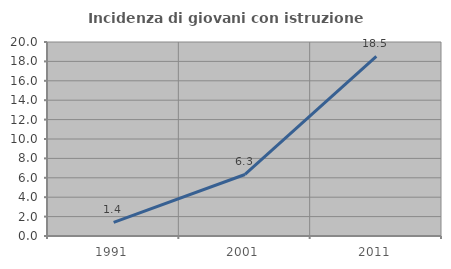
| Category | Incidenza di giovani con istruzione universitaria |
|---|---|
| 1991.0 | 1.395 |
| 2001.0 | 6.343 |
| 2011.0 | 18.519 |